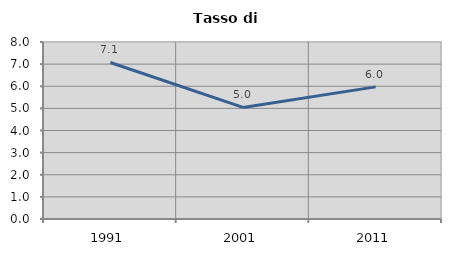
| Category | Tasso di disoccupazione   |
|---|---|
| 1991.0 | 7.074 |
| 2001.0 | 5.043 |
| 2011.0 | 5.972 |